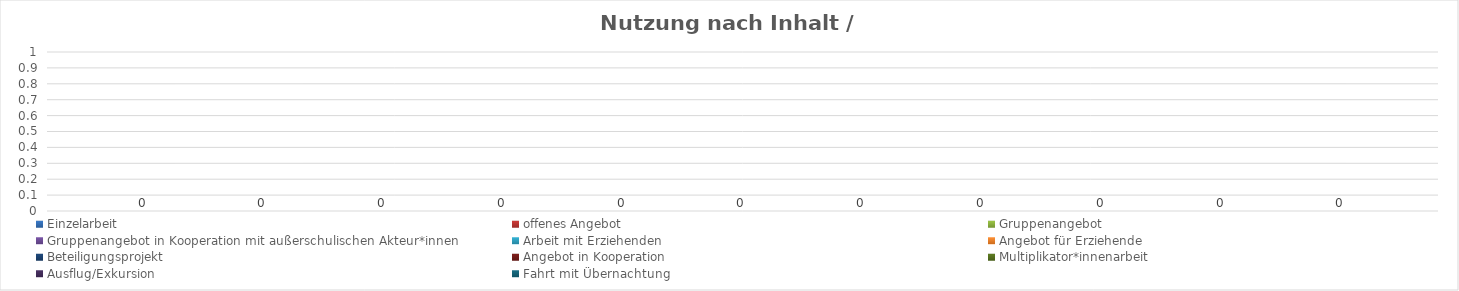
| Category | Einzelarbeit | offenes Angebot | Gruppenangebot | Gruppenangebot in Kooperation mit außerschulischen Akteur*innen | Arbeit mit Erziehenden | Angebot für Erziehende | Beteiligungsprojekt | Angebot in Kooperation | Multiplikator*innenarbeit | Ausflug/Exkursion | Fahrt mit Übernachtung |
|---|---|---|---|---|---|---|---|---|---|---|---|
| 0 | 0 | 0 | 0 | 0 | 0 | 0 | 0 | 0 | 0 | 0 | 0 |